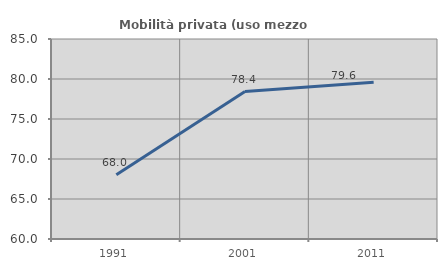
| Category | Mobilità privata (uso mezzo privato) |
|---|---|
| 1991.0 | 68.027 |
| 2001.0 | 78.431 |
| 2011.0 | 79.592 |